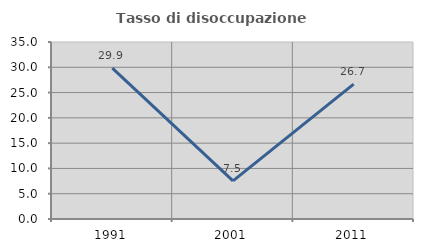
| Category | Tasso di disoccupazione giovanile  |
|---|---|
| 1991.0 | 29.851 |
| 2001.0 | 7.547 |
| 2011.0 | 26.667 |